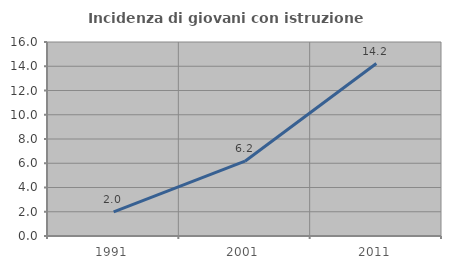
| Category | Incidenza di giovani con istruzione universitaria |
|---|---|
| 1991.0 | 1.984 |
| 2001.0 | 6.17 |
| 2011.0 | 14.224 |